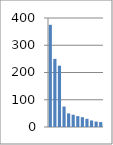
| Category | Series 0 |
|---|---|
| 0 | 375 |
| 1 | 250 |
| 2 | 225 |
| 3 | 75 |
| 4 | 50 |
| 5 | 45 |
| 6 | 40 |
| 7 | 36 |
| 8 | 30 |
| 9 | 24 |
| 10 | 20 |
| 11 | 18 |